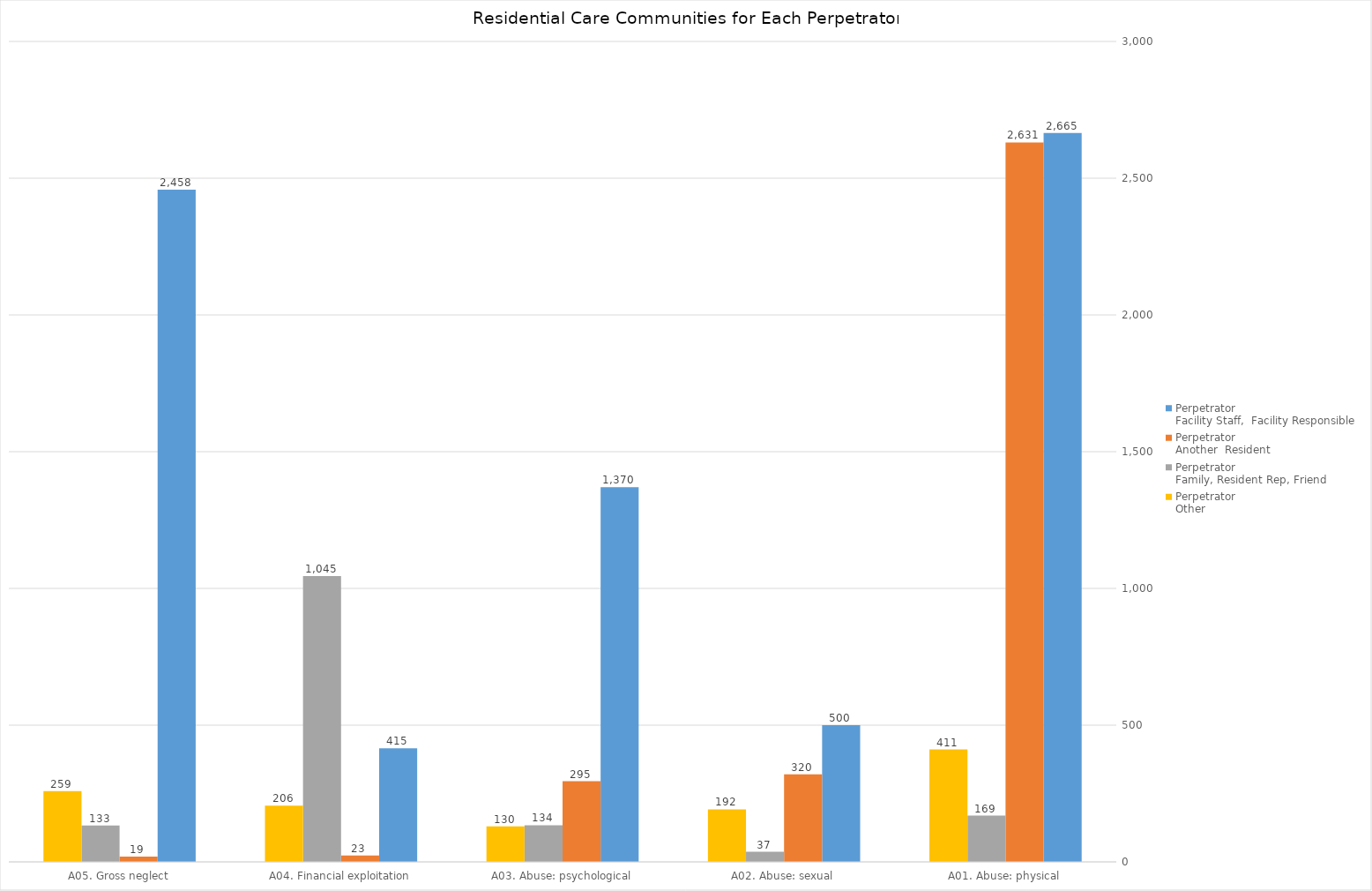
| Category | Perpetrator
Facility Staff,  Facility Responsible | Perpetrator
Another  Resident | Perpetrator
Family, Resident Rep, Friend | Perpetrator
Other |
|---|---|---|---|---|
| A01. Abuse: physical | 2665 | 2631 | 169 | 411 |
| A02. Abuse: sexual | 500 | 320 | 37 | 192 |
| A03. Abuse: psychological | 1370 | 295 | 134 | 130 |
| A04. Financial exploitation | 415 | 23 | 1045 | 206 |
| A05. Gross neglect | 2458 | 19 | 133 | 259 |